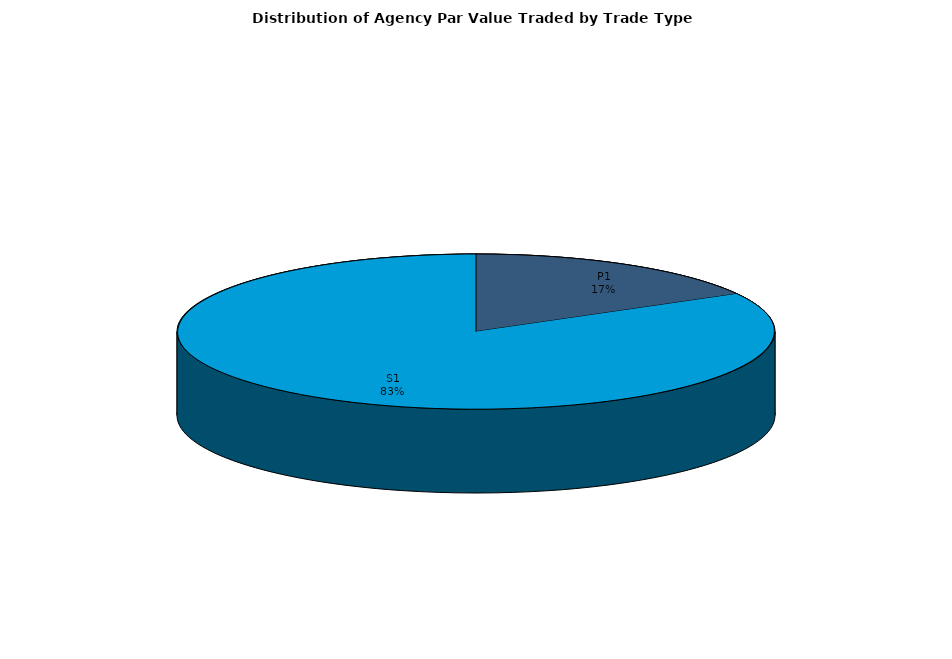
| Category | Series 0 |
|---|---|
| P1 | 2331996.722 |
| S1 | 11461306.086 |